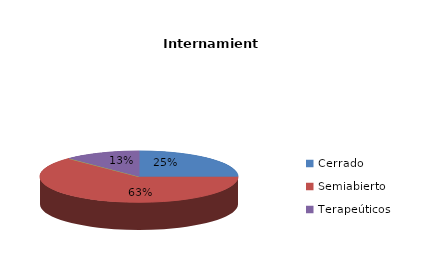
| Category | Series 0 |
|---|---|
| Cerrado | 2 |
| Semiabierto | 5 |
| Abierto | 0 |
| Terapeúticos | 1 |